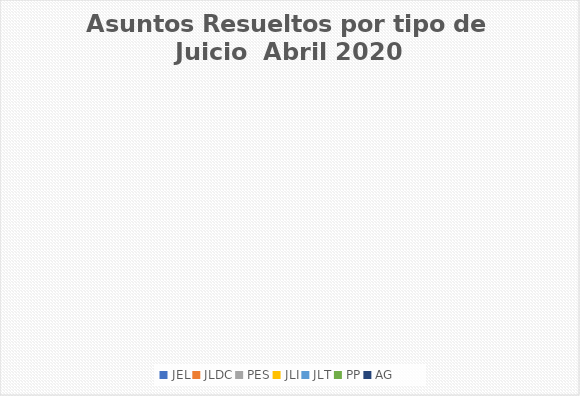
| Category | Asuntos Resueltos por tipo de Juicio  Abril |
|---|---|
| JEL | 0 |
| JLDC | 0 |
| PES | 0 |
| JLI | 0 |
| JLT | 0 |
| PP | 0 |
| AG | 0 |